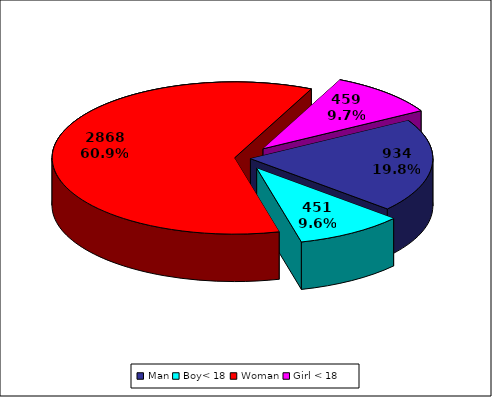
| Category | TOTAL |
|---|---|
| Man | 934 |
| Boy< 18 | 451 |
| Woman | 2868 |
| Girl < 18 | 459 |